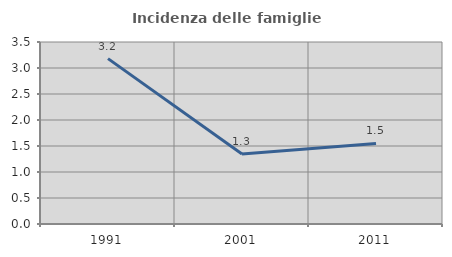
| Category | Incidenza delle famiglie numerose |
|---|---|
| 1991.0 | 3.181 |
| 2001.0 | 1.345 |
| 2011.0 | 1.548 |